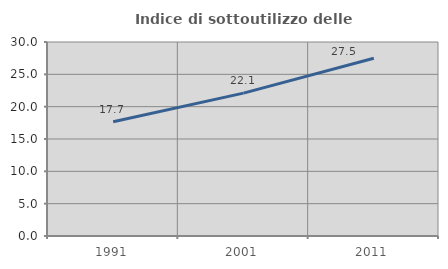
| Category | Indice di sottoutilizzo delle abitazioni  |
|---|---|
| 1991.0 | 17.667 |
| 2001.0 | 22.092 |
| 2011.0 | 27.489 |